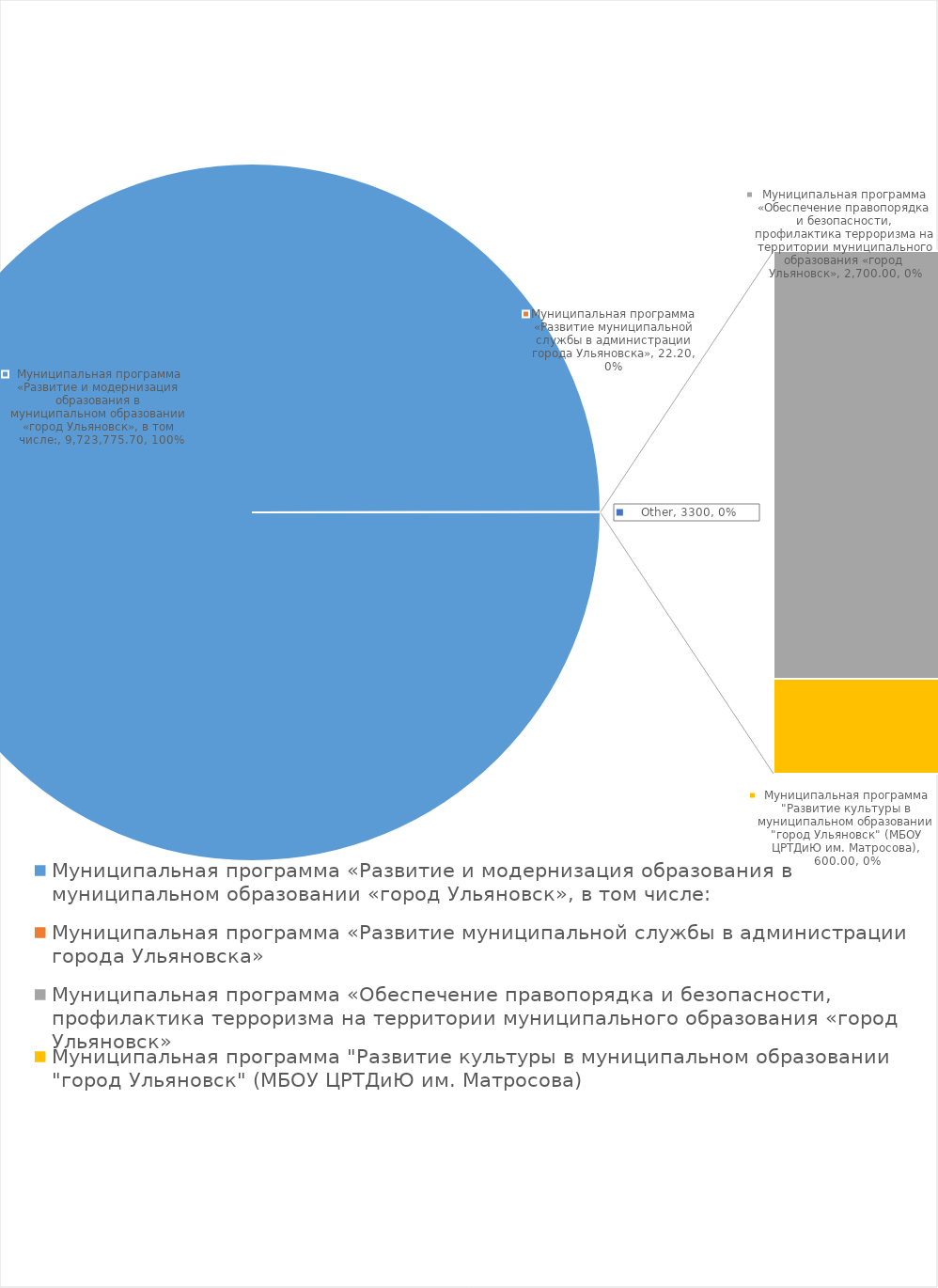
| Category | Series 0 |
|---|---|
| Муниципальная программа «Развитие и модернизация образования в муниципальном образовании «город Ульяновск», в том числе: | 9723775.7 |
| Муниципальная программа «Развитие муниципальной службы в администрации города Ульяновска» | 22.2 |
| Муниципальная программа «Обеспечение правопорядка и безопасности, профилактика терроризма на территории муниципального образования «город Ульяновск» | 2700 |
| Муниципальная программа "Развитие культуры в муниципальном образовании "город Ульяновск" (МБОУ ЦРТДиЮ им. Матросова) | 600 |